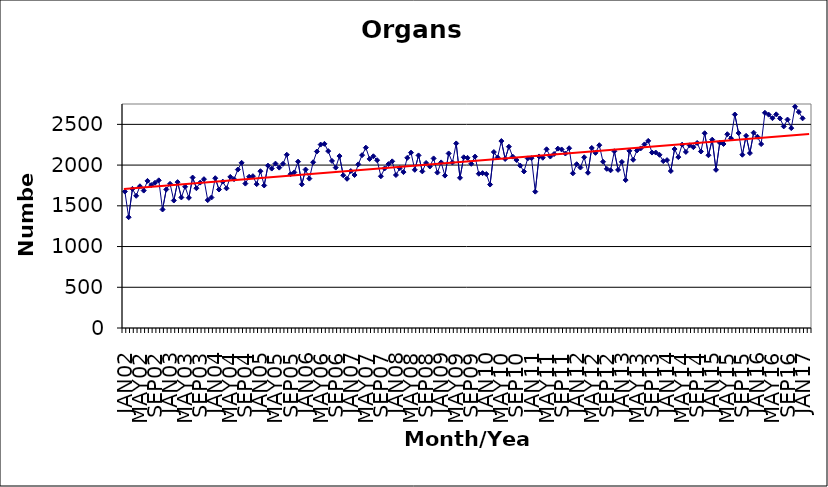
| Category | Series 0 |
|---|---|
| JAN02 | 1675 |
| FEB02 | 1360 |
| MAR02 | 1708 |
| APR02 | 1623 |
| MAY02 | 1740 |
| JUN02 | 1687 |
| JUL02 | 1806 |
| AUG02 | 1755 |
| SEP02 | 1783 |
| OCT02 | 1813 |
| NOV02 | 1455 |
| DEC02 | 1701 |
| JAN03 | 1770 |
| FEB03 | 1565 |
| MAR03 | 1791 |
| APR03 | 1603 |
| MAY03 | 1734 |
| JUN03 | 1598 |
| JUL03 | 1847 |
| AUG03 | 1716 |
| SEP03 | 1785 |
| OCT03 | 1827 |
| NOV03 | 1570 |
| DEC03 | 1602 |
| JAN04 | 1839 |
| FEB04 | 1700 |
| MAR04 | 1797 |
| APR04 | 1715 |
| MAY04 | 1855 |
| JUN04 | 1827 |
| JUL04 | 1945 |
| AUG04 | 2028 |
| SEP04 | 1773 |
| OCT04 | 1857 |
| NOV04 | 1864 |
| DEC04 | 1766 |
| JAN05 | 1925 |
| FEB05 | 1750 |
| MAR05 | 1993 |
| APR05 | 1957 |
| MAY05 | 2018 |
| JUN05 | 1969 |
| JUL05 | 2016 |
| AUG05 | 2127 |
| SEP05 | 1888 |
| OCT05 | 1910 |
| NOV05 | 2042 |
| DEC05 | 1764 |
| JAN06 | 1945 |
| FEB06 | 1834 |
| MAR06 | 2035 |
| APR06 | 2167 |
| MAY06 | 2252 |
| JUN06 | 2261 |
| JUL06 | 2172 |
| AUG06 | 2051 |
| SEP06 | 1969 |
| OCT06 | 2111 |
| NOV06 | 1875 |
| DEC06 | 1832 |
| JAN07 | 1927 |
| FEB07 | 1878 |
| MAR07 | 2009 |
| APR07 | 2122 |
| MAY07 | 2214 |
| JUN07 | 2076 |
| JUL07 | 2108 |
| AUG07 | 2060 |
| SEP07 | 1863 |
| OCT07 | 1959 |
| NOV07 | 2012 |
| DEC07 | 2046 |
| JAN08 | 1878 |
| FEB08 | 1962 |
| MAR08 | 1914 |
| APR08 | 2089 |
| MAY08 | 2153 |
| JUN08 | 1942 |
| JUL08 | 2119 |
| AUG08 | 1923 |
| SEP08 | 2026 |
| OCT08 | 1983 |
| NOV08 | 2082 |
| DEC08 | 1908 |
| JAN09 | 2033 |
| FEB09 | 1871 |
| MAR09 | 2143 |
| APR09 | 2032 |
| MAY09 | 2266 |
| JUN09 | 1844 |
| JUL09 | 2096 |
| AUG09 | 2089 |
| SEP09 | 2016 |
| OCT09 | 2104 |
| NOV09 | 1894 |
| DEC09 | 1901 |
| JAN10 | 1890 |
| FEB10 | 1761 |
| MAR10 | 2160 |
| APR10 | 2094 |
| MAY10 | 2295 |
| JUN10 | 2075 |
| JUL10 | 2226 |
| AUG10 | 2104 |
| SEP10 | 2062 |
| OCT10 | 1994 |
| NOV10 | 1922 |
| DEC10 | 2082 |
| JAN11 | 2085 |
| FEB11 | 1674 |
| MAR11 | 2106 |
| APR11 | 2090 |
| MAY11 | 2194 |
| JUN11 | 2105 |
| JUL11 | 2136 |
| AUG11 | 2202 |
| SEP11 | 2192 |
| OCT11 | 2142 |
| NOV11 | 2207 |
| DEC11 | 1899 |
| JAN12 | 2011 |
| FEB12 | 1970 |
| MAR12 | 2096 |
| APR12 | 1906 |
| MAY12 | 2210 |
| JUN12 | 2150 |
| JUL12 | 2244 |
| AUG12 | 2041 |
| SEP12 | 1954 |
| OCT12 | 1936 |
| NOV12 | 2170 |
| DEC12 | 1941 |
| JAN13 | 2039 |
| FEB13 | 1816 |
| MAR13 | 2175 |
| APR13 | 2065 |
| MAY13 | 2179 |
| JUN13 | 2205 |
| JUL13 | 2254 |
| AUG13 | 2297 |
| SEP13 | 2154 |
| OCT13 | 2154 |
| NOV13 | 2126 |
| DEC13 | 2049 |
| JAN14 | 2061 |
| FEB14 | 1927 |
| MAR14 | 2197 |
| APR14 | 2098 |
| MAY14 | 2251 |
| JUN14 | 2162 |
| JUL14 | 2243 |
| AUG14 | 2220 |
| SEP14 | 2272 |
| OCT14 | 2167 |
| NOV14 | 2391 |
| DEC14 | 2121 |
| JAN15 | 2312 |
| FEB15 | 1942 |
| MAR15 | 2275 |
| APR15 | 2259 |
| MAY15 | 2379 |
| JUN15 | 2328 |
| JUL15 | 2621 |
| AUG15 | 2393 |
| SEP15 | 2127 |
| OCT15 | 2359 |
| NOV15 | 2147 |
| DEC15 | 2398 |
| JAN16 | 2348 |
| FEB16 | 2258 |
| MAR16 | 2642 |
| APR16 | 2619 |
| MAY16 | 2576 |
| JUN16 | 2623 |
| JUL16 | 2573 |
| AUG16 | 2475 |
| SEP16 | 2559 |
| OCT16 | 2454 |
| NOV16 | 2717 |
| DEC16 | 2652 |
| JAN17 | 2574 |